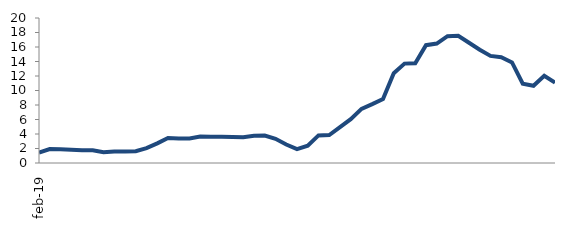
| Category | Series 0 |
|---|---|
| 2019-02-01 | 1.432 |
| 2019-03-01 | 1.92 |
| 2019-04-01 | 1.902 |
| 2019-05-01 | 1.814 |
| 2019-06-01 | 1.756 |
| 2019-07-01 | 1.75 |
| 2019-08-01 | 1.495 |
| 2019-09-01 | 1.596 |
| 2019-10-01 | 1.597 |
| 2019-11-01 | 1.624 |
| 2019-12-01 | 2.057 |
| 2020-01-01 | 2.71 |
| 2020-02-01 | 3.453 |
| 2020-03-01 | 3.382 |
| 2020-04-01 | 3.383 |
| 2020-05-01 | 3.648 |
| 2020-06-01 | 3.638 |
| 2020-07-01 | 3.61 |
| 2020-08-01 | 3.571 |
| 2020-09-01 | 3.559 |
| 2020-10-01 | 3.75 |
| 2020-11-01 | 3.789 |
| 2020-12-01 | 3.346 |
| 2021-01-01 | 2.551 |
| 2021-02-01 | 1.916 |
| 2021-03-01 | 2.39 |
| 2021-04-01 | 3.807 |
| 2021-05-01 | 3.85 |
| 2021-06-01 | 4.942 |
| 2021-07-01 | 6.041 |
| 2021-08-01 | 7.459 |
| 2021-09-01 | 8.119 |
| 2021-10-01 | 8.829 |
| 2021-11-01 | 12.381 |
| 2021-12-01 | 13.709 |
| 2022-01-01 | 13.747 |
| 2022-02-01 | 16.254 |
| 2022-03-01 | 16.473 |
| 2022-04-01 | 17.493 |
| 2022-05-01 | 17.552 |
| 2022-06-01 | 16.588 |
| 2022-07-01 | 15.631 |
| 2022-08-01 | 14.77 |
| 2022-09-01 | 14.59 |
| 2022-10-01 | 13.87 |
| 2022-11-01 | 10.941 |
| 2022-12-01 | 10.654 |
| 2023-01-01 | 12.036 |
| 2023-02-01 | 11.079 |